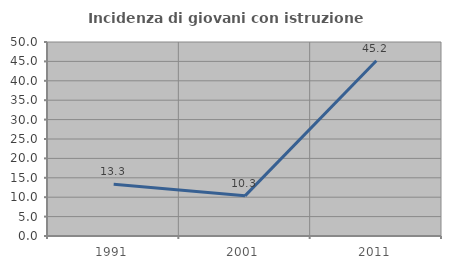
| Category | Incidenza di giovani con istruzione universitaria |
|---|---|
| 1991.0 | 13.333 |
| 2001.0 | 10.345 |
| 2011.0 | 45.161 |